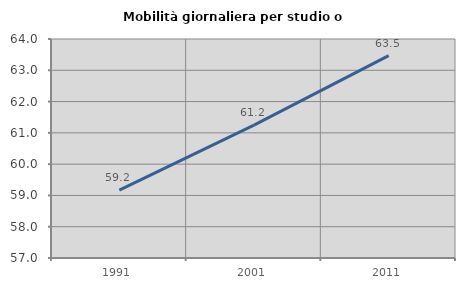
| Category | Mobilità giornaliera per studio o lavoro |
|---|---|
| 1991.0 | 59.172 |
| 2001.0 | 61.247 |
| 2011.0 | 63.471 |